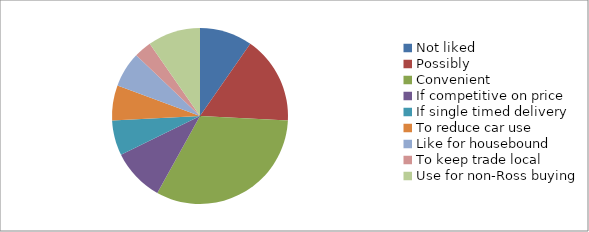
| Category | Series 1 | Series 0 |
|---|---|---|
| Not liked | 3 | 3 |
| Possibly | 5 | 5 |
| Convenient | 10 | 10 |
| If competitive on price | 3 | 3 |
| If single timed delivery | 2 | 2 |
| To reduce car use | 2 | 2 |
| Like for housebound | 2 | 2 |
| To keep trade local | 1 | 1 |
| Use for non-Ross buying | 3 | 3 |